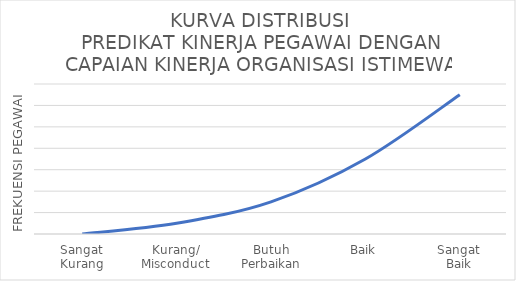
| Category | KURVA DISTRIBUSI
PREDIKAT KINERJA PEGAWAI DENGAN
CAPAIAN KINERJA ORGANISASI ISTIMEWA |
|---|---|
| Sangat
Kurang | 0 |
| Kurang/
Misconduct | 1 |
| Butuh
Perbaikan | 3 |
| Baik | 7 |
| Sangat
Baik | 13 |